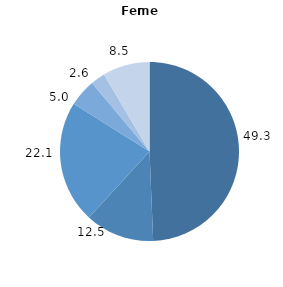
| Category | Series 0 |
|---|---|
| 0 | 49.341 |
| 1 | 12.487 |
| 2 | 22.104 |
| 3 | 4.966 |
| 4 | 2.608 |
| 5 | 8.492 |